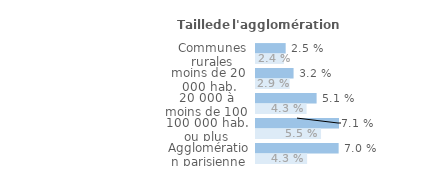
| Category | Series 1 | Series 0 |
|---|---|---|
| Communes rurales | 0.025 | 0.024 |
| moins de 20 000 hab. | 0.032 | 0.029 |
| 20 000 à moins de 100 000 hab. | 0.051 | 0.043 |
| 100 000 hab. ou plus | 0.071 | 0.055 |
| Agglomération parisienne | 0.07 | 0.043 |